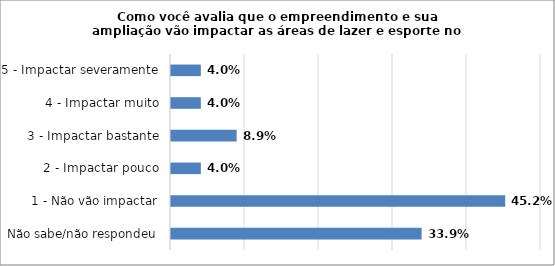
| Category | Series 0 |
|---|---|
| Não sabe/não respondeu | 0.339 |
| 1 - Não vão impactar | 0.452 |
| 2 - Impactar pouco | 0.04 |
| 3 - Impactar bastante | 0.089 |
| 4 - Impactar muito | 0.04 |
| 5 - Impactar severamente | 0.04 |